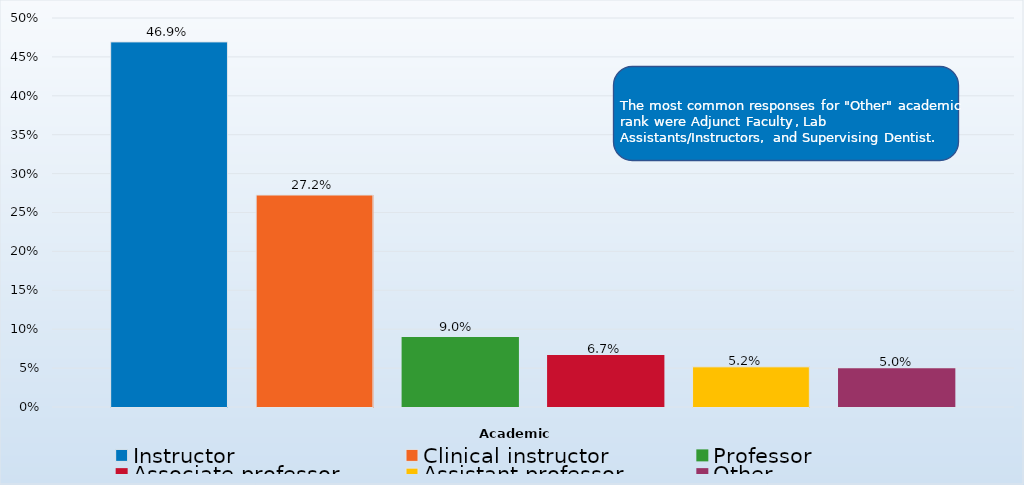
| Category | Instructor | Clinical instructor | Professor | Associate professor | Assistant professor | Other |
|---|---|---|---|---|---|---|
| 0 | 0.469 | 0.272 | 0.09 | 0.067 | 0.052 | 0.05 |